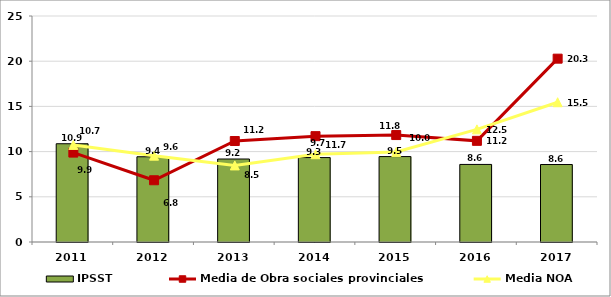
| Category | IPSST |
|---|---|
| 2011.0 | 10.87 |
| 2012.0 | 9.43 |
| 2013.0 | 9.18 |
| 2014.0 | 9.34 |
| 2015.0 | 9.45 |
| 2016.0 | 8.58 |
| 2017.0 | 8.57 |